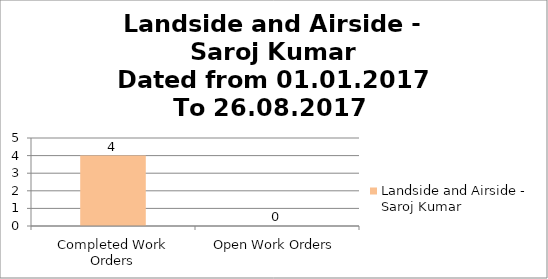
| Category | Landside and Airside - Saroj Kumar  |
|---|---|
| Completed Work Orders | 4 |
| Open Work Orders | 0 |